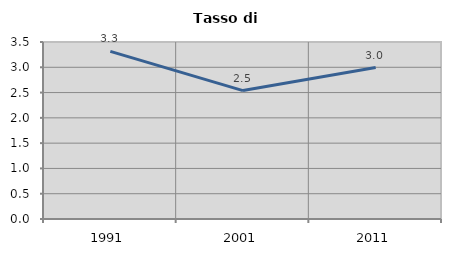
| Category | Tasso di disoccupazione   |
|---|---|
| 1991.0 | 3.314 |
| 2001.0 | 2.539 |
| 2011.0 | 2.994 |